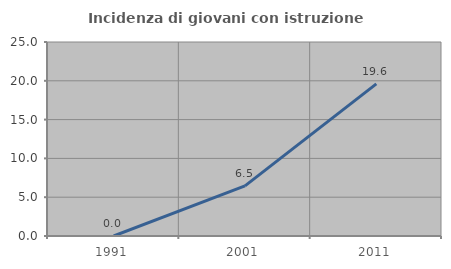
| Category | Incidenza di giovani con istruzione universitaria |
|---|---|
| 1991.0 | 0 |
| 2001.0 | 6.452 |
| 2011.0 | 19.608 |